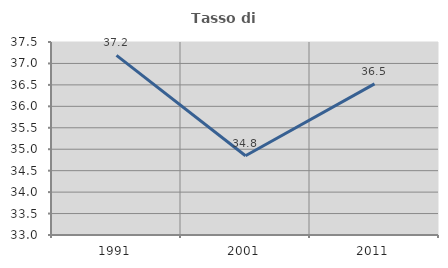
| Category | Tasso di occupazione   |
|---|---|
| 1991.0 | 37.189 |
| 2001.0 | 34.848 |
| 2011.0 | 36.524 |